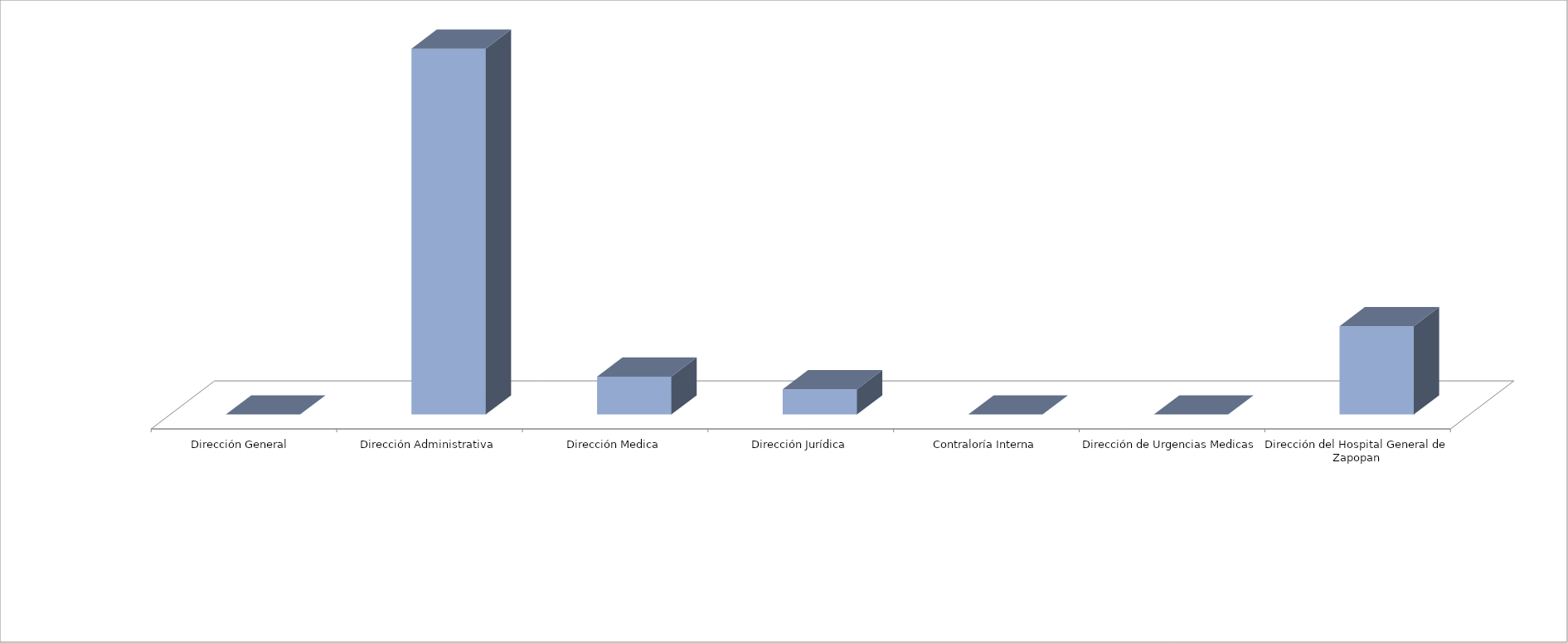
| Category | Series 0 | Series 1 |
|---|---|---|
| Dirección General  |  | 0 |
| Dirección Administrativa |  | 29 |
| Dirección Medica |  | 3 |
| Dirección Jurídica |  | 2 |
| Contraloría Interna |  | 0 |
| Dirección de Urgencias Medicas |  | 0 |
| Dirección del Hospital General de Zapopan |  | 7 |